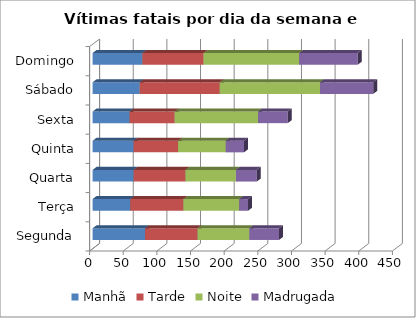
| Category | Manhã | Tarde | Noite | Madrugada |
|---|---|---|---|---|
| Segunda | 78 | 78 | 77 | 44 |
| Terça | 56 | 79 | 83 | 13 |
| Quarta | 61 | 77 | 75 | 31 |
| Quinta | 61 | 66 | 71 | 27 |
| Sexta | 55 | 67 | 124 | 44 |
| Sábado | 70 | 119 | 149 | 79 |
| Domingo | 74 | 91 | 142 | 87 |